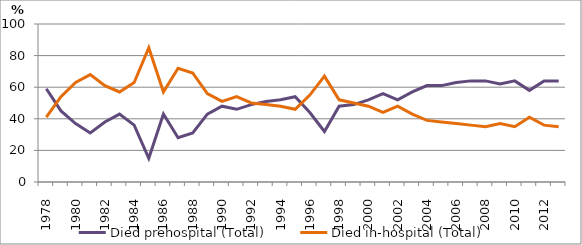
| Category | Died prehospital (Total) | Died in-hospital (Total) |
|---|---|---|
| 1978.0 | 59 | 41 |
| 1979.0 | 45 | 54 |
| 1980.0 | 37 | 63 |
| 1981.0 | 31 | 68 |
| 1982.0 | 38 | 61 |
| 1983.0 | 43 | 57 |
| 1984.0 | 36 | 63 |
| 1985.0 | 15 | 85 |
| 1986.0 | 43 | 57 |
| 1987.0 | 28 | 72 |
| 1988.0 | 31 | 69 |
| 1989.0 | 43 | 56 |
| 1990.0 | 48 | 51 |
| 1991.0 | 46 | 54 |
| 1992.0 | 49 | 50 |
| 1993.0 | 51 | 49 |
| 1994.0 | 52 | 48 |
| 1995.0 | 54 | 46 |
| 1996.0 | 44 | 55 |
| 1997.0 | 32 | 67 |
| 1998.0 | 48 | 52 |
| 1999.0 | 49 | 50 |
| 2000.0 | 52 | 48 |
| 2001.0 | 56 | 44 |
| 2002.0 | 52 | 48 |
| 2003.0 | 57 | 43 |
| 2004.0 | 61 | 39 |
| 2005.0 | 61 | 38 |
| 2006.0 | 63 | 37 |
| 2007.0 | 64 | 36 |
| 2008.0 | 64 | 35 |
| 2009.0 | 62 | 37 |
| 2010.0 | 64 | 35 |
| 2011.0 | 58 | 41 |
| 2012.0 | 64 | 36 |
| 2013.0 | 64 | 35 |